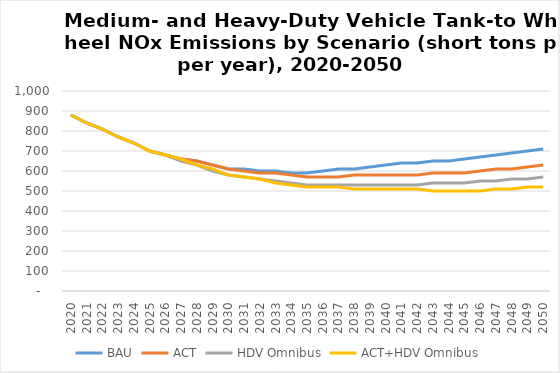
| Category | BAU | ACT | HDV Omnibus | ACT+HDV Omnibus |
|---|---|---|---|---|
| 2020.0 | 880 | 880 | 880 | 880 |
| 2021.0 | 840 | 840 | 840 | 840 |
| 2022.0 | 810 | 810 | 810 | 810 |
| 2023.0 | 770 | 770 | 770 | 770 |
| 2024.0 | 740 | 740 | 740 | 740 |
| 2025.0 | 700 | 700 | 700 | 700 |
| 2026.0 | 680 | 680 | 680 | 680 |
| 2027.0 | 660 | 660 | 650 | 660 |
| 2028.0 | 650 | 650 | 630 | 630 |
| 2029.0 | 630 | 630 | 600 | 610 |
| 2030.0 | 610 | 610 | 580 | 580 |
| 2031.0 | 610 | 600 | 570 | 570 |
| 2032.0 | 600 | 590 | 560 | 560 |
| 2033.0 | 600 | 590 | 550 | 540 |
| 2034.0 | 590 | 580 | 540 | 530 |
| 2035.0 | 590 | 570 | 530 | 520 |
| 2036.0 | 600 | 570 | 530 | 520 |
| 2037.0 | 610 | 570 | 530 | 520 |
| 2038.0 | 610 | 580 | 530 | 510 |
| 2039.0 | 620 | 580 | 530 | 510 |
| 2040.0 | 630 | 580 | 530 | 510 |
| 2041.0 | 640 | 580 | 530 | 510 |
| 2042.0 | 640 | 580 | 530 | 510 |
| 2043.0 | 650 | 590 | 540 | 500 |
| 2044.0 | 650 | 590 | 540 | 500 |
| 2045.0 | 660 | 590 | 540 | 500 |
| 2046.0 | 670 | 600 | 550 | 500 |
| 2047.0 | 680 | 610 | 550 | 510 |
| 2048.0 | 690 | 610 | 560 | 510 |
| 2049.0 | 700 | 620 | 560 | 520 |
| 2050.0 | 710 | 630 | 570 | 520 |